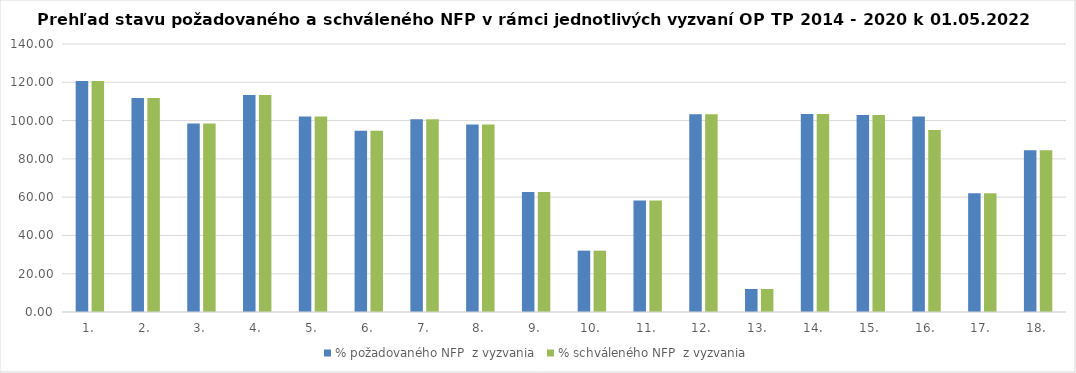
| Category | % požadovaného NFP  z vyzvania | % schváleného NFP  z vyzvania |
|---|---|---|
| 1. | 120.662 | 120.662 |
| 2. | 111.83 | 111.83 |
| 3. | 98.465 | 98.465 |
| 4. | 113.295 | 113.295 |
| 5. | 102.19 | 102.19 |
| 6. | 94.643 | 94.643 |
| 7. | 100.637 | 100.637 |
| 8. | 97.989 | 97.989 |
| 9. | 62.721 | 62.721 |
| 10. | 32.038 | 32.038 |
| 11. | 58.283 | 58.283 |
| 12. | 103.242 | 103.242 |
| 13. | 12.008 | 12.008 |
| 14. | 103.392 | 103.392 |
| 15. | 102.872 | 102.872 |
| 16. | 102.176 | 95.126 |
| 17. | 61.969 | 61.969 |
| 18. | 84.514 | 84.514 |